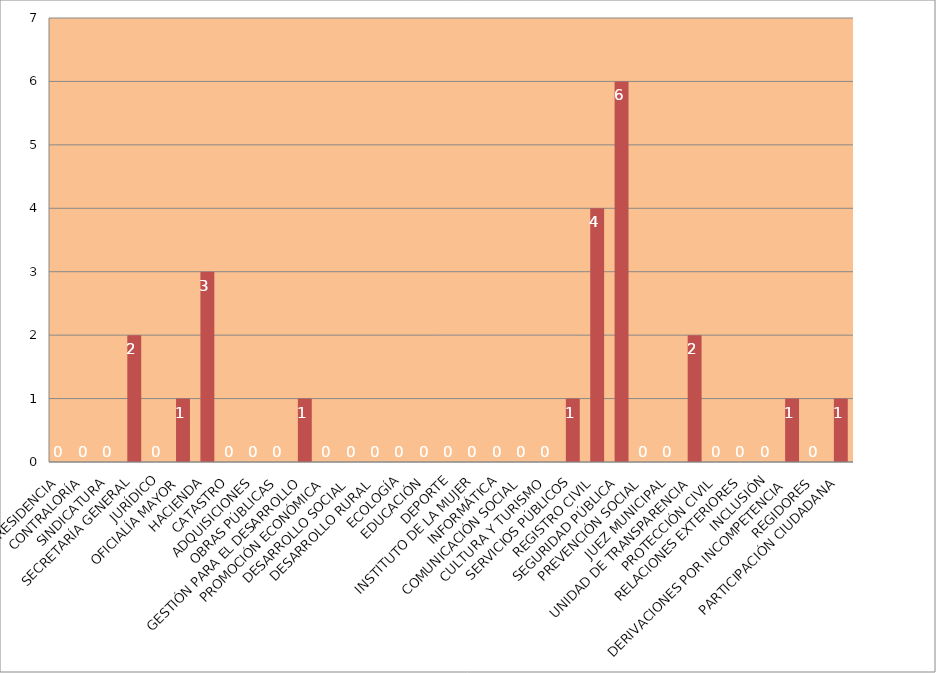
| Category | Series 0 |
|---|---|
| PRESIDENCIA | 0 |
| CONTRALORÍA | 0 |
| SINDICATURA | 0 |
| SECRETARÍA GENERAL | 2 |
| JURÍDICO | 0 |
| OFICIALÍA MAYOR | 1 |
| HACIENDA | 3 |
| CATASTRO | 0 |
| ADQUISICIONES | 0 |
| OBRAS PÚBLICAS | 0 |
| GESTIÓN PARA EL DESARROLLO | 1 |
| PROMOCIÓN ECONÓMICA | 0 |
| DESARROLLO SOCIAL | 0 |
| DESARROLLO RURAL | 0 |
| ECOLOGÍA | 0 |
| EDUCACIÓN | 0 |
| DEPORTE | 0 |
| INSTITUTO DE LA MUJER | 0 |
| INFORMÁTICA | 0 |
| COMUNICACIÓN SOCIAL | 0 |
| CULTURA Y TURISMO | 0 |
| SERVICIOS PÚBLICOS | 1 |
| REGISTRO CIVIL | 4 |
| SEGURIDAD PÚBLICA | 6 |
| PREVENCIÓN SOCIAL | 0 |
| JUEZ MUNICIPAL | 0 |
| UNIDAD DE TRANSPARENCIA | 2 |
| PROTECCIÓN CIVIL | 0 |
| RELACIONES EXTERIORES | 0 |
| INCLUSIÓN | 0 |
| DERIVACIONES POR INCOMPETENCIA | 1 |
| REGIDORES | 0 |
| PARTICIPACIÓN CIUDADANA | 1 |